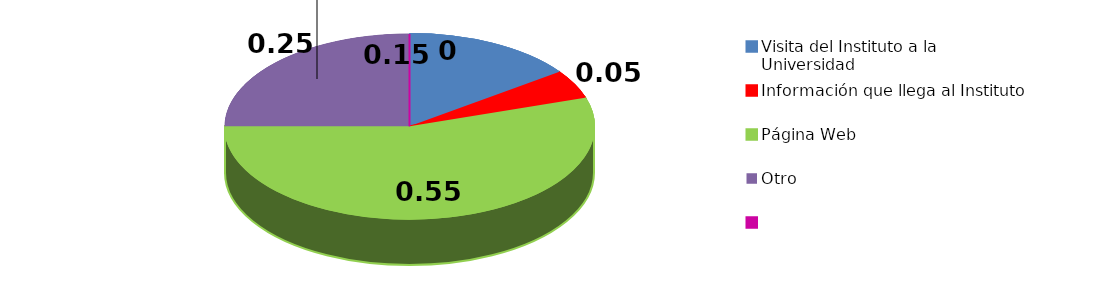
| Category | Sí | No |
|---|---|---|
| Visita del Instituto a la Universidad | 3 | 96 |
| Información que llega al Instituto | 1 | 97 |
| Página Web | 11 | 98 |
| Otro | 5 | 99 |